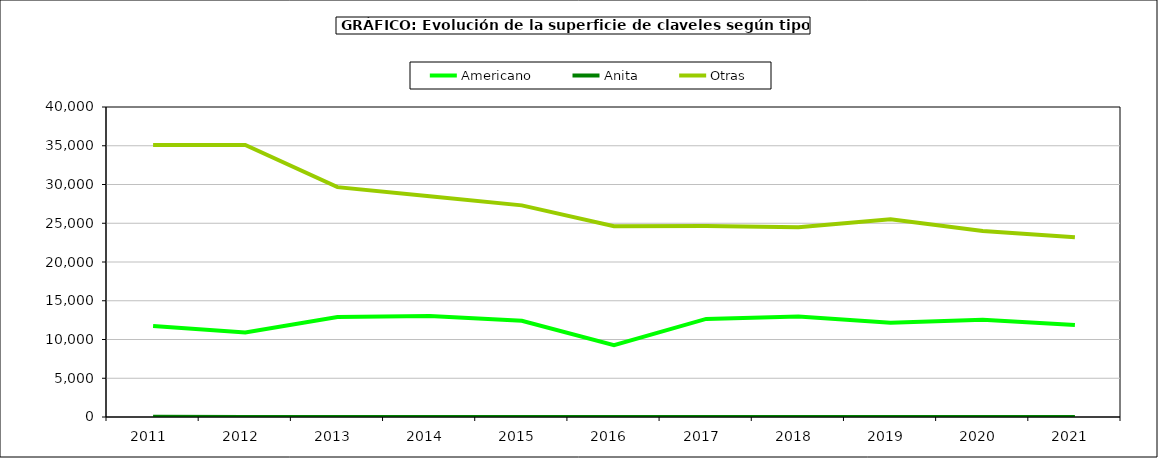
| Category | Americano | Anita | Otras |
|---|---|---|---|
| 2011.0 | 11730 | 30 | 35100 |
| 2012.0 | 10894 | 0 | 35100 |
| 2013.0 | 12913 | 0 | 29659 |
| 2014.0 | 13022 | 0 | 28479 |
| 2015.0 | 12405 | 0 | 27308 |
| 2016.0 | 9252 | 0 | 24628 |
| 2017.0 | 12655 | 0 | 24631 |
| 2018.0 | 12974 | 0 | 24470 |
| 2019.0 | 12146 | 8 | 25500 |
| 2020.0 | 12548 | 12 | 23994 |
| 2021.0 | 11870 | 12 | 23179 |